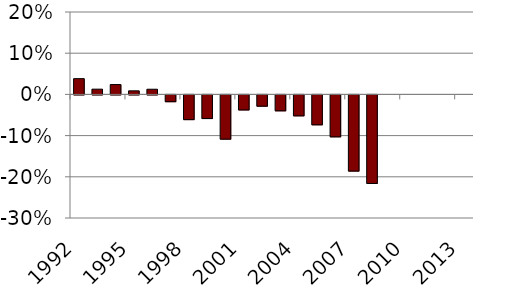
| Category | Series 0 |
|---|---|
| 1992.0 | 0.038 |
| 1993.0 | 0.013 |
| 1994.0 | 0.024 |
| 1995.0 | 0.009 |
| 1996.0 | 0.013 |
| 1997.0 | -0.017 |
| 1998.0 | -0.06 |
| 1999.0 | -0.057 |
| 2000.0 | -0.107 |
| 2001.0 | -0.037 |
| 2002.0 | -0.027 |
| 2003.0 | -0.039 |
| 2004.0 | -0.051 |
| 2005.0 | -0.073 |
| 2006.0 | -0.102 |
| 2007.0 | -0.185 |
| 2008.0 | -0.215 |
| 2009.0 | 0 |
| 2010.0 | 0 |
| 2011.0 | 0 |
| 2012.0 | 0 |
| 2013.0 | 0 |